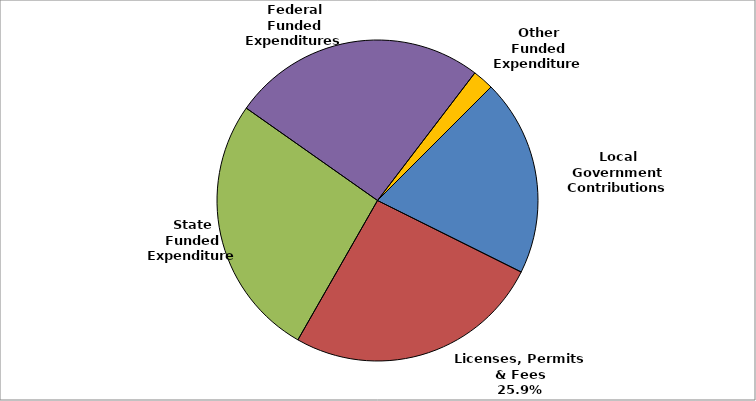
| Category | Series 0 |
|---|---|
| Local Government Contributions | 0.199 |
| Licenses, Permits & Fees | 0.259 |
| State Funded Expenditures | 0.265 |
| Federal Funded Expenditures | 0.256 |
| Other Funded Expenditures | 0.021 |